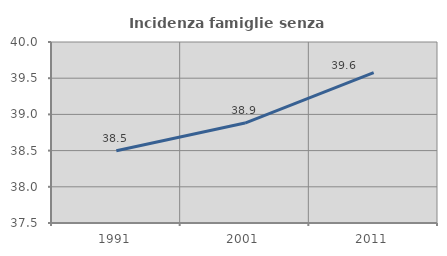
| Category | Incidenza famiglie senza nuclei |
|---|---|
| 1991.0 | 38.499 |
| 2001.0 | 38.881 |
| 2011.0 | 39.578 |